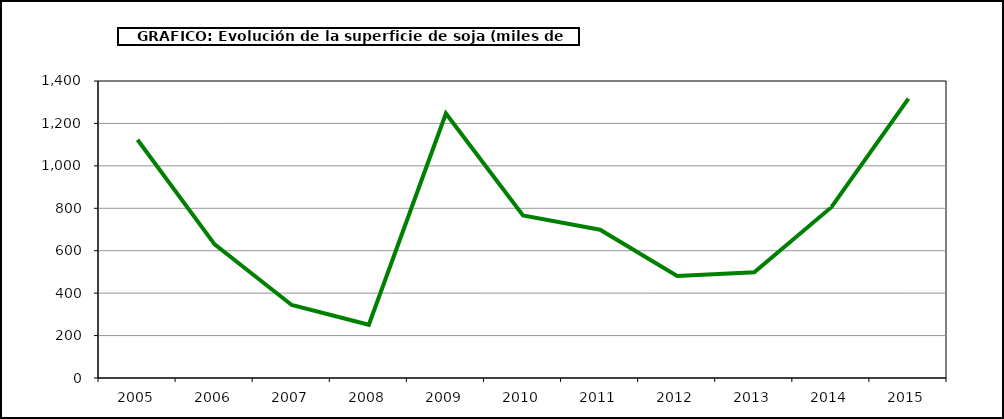
| Category | Superficie |
|---|---|
| 2005.0 | 1123 |
| 2006.0 | 630 |
| 2007.0 | 344 |
| 2008.0 | 251 |
| 2009.0 | 1247 |
| 2010.0 | 766 |
| 2011.0 | 699 |
| 2012.0 | 481 |
| 2013.0 | 498 |
| 2014.0 | 805 |
| 2015.0 | 1317 |